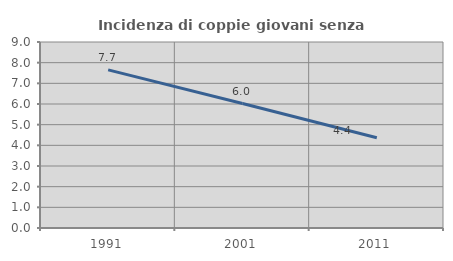
| Category | Incidenza di coppie giovani senza figli |
|---|---|
| 1991.0 | 7.653 |
| 2001.0 | 6.021 |
| 2011.0 | 4.367 |